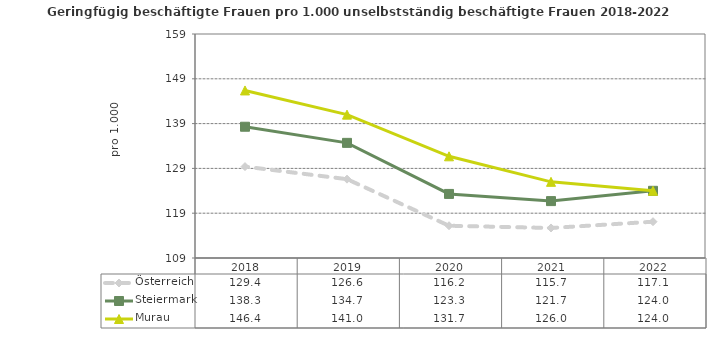
| Category | Österreich | Steiermark | Murau |
|---|---|---|---|
| 2022.0 | 117.1 | 124 | 124 |
| 2021.0 | 115.7 | 121.7 | 126 |
| 2020.0 | 116.2 | 123.3 | 131.7 |
| 2019.0 | 126.6 | 134.7 | 141 |
| 2018.0 | 129.4 | 138.3 | 146.4 |